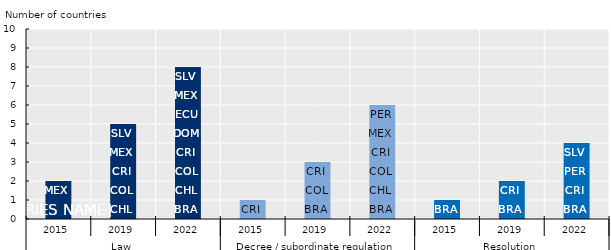
| Category | ARG | BRA | CHL | COL | CRI | DOM | ECU | MEX | PER | PRY | SLV |
|---|---|---|---|---|---|---|---|---|---|---|---|
| 0 | 0 | 0 | 0 | 0 | 1 | 0 | 0 | 1 | 0 | 0 | 0 |
| 1 | 0 | 0 | 1 | 1 | 1 | 0 | 0 | 1 | 0 | 0 | 1 |
| 2 | 0 | 1 | 1 | 1 | 1 | 1 | 1 | 1 | 0 | 0 | 1 |
| 3 | 0 | 0 | 0 | 0 | 1 | 0 | 0 | 0 | 0 | 0 | 0 |
| 4 | 0 | 1 | 0 | 1 | 1 | 0 | 0 | 0 | 0 | 0 | 0 |
| 5 | 0 | 1 | 1 | 1 | 1 | 0 | 0 | 1 | 1 | 0 | 0 |
| 6 | 0 | 1 | 0 | 0 | 0 | 0 | 0 | 0 | 0 | 0 | 0 |
| 7 | 0 | 1 | 0 | 0 | 1 | 0 | 0 | 0 | 0 | 0 | 0 |
| 8 | 0 | 1 | 0 | 0 | 1 | 0 | 0 | 0 | 1 | 0 | 1 |